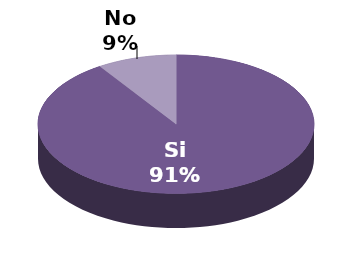
| Category | Series 1 |
|---|---|
| Si | 39 |
| No | 4 |